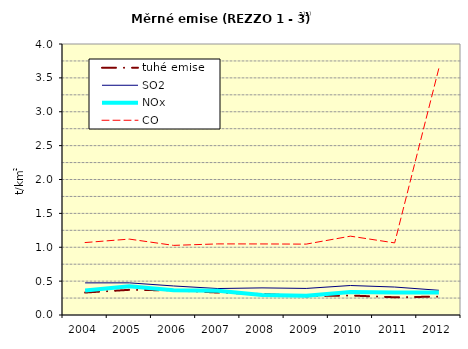
| Category | tuhé emise | SO2 | NOx | CO |
|---|---|---|---|---|
| 2004.0 | 0.332 | 0.474 | 0.361 | 1.069 |
| 2005.0 | 0.372 | 0.475 | 0.425 | 1.12 |
| 2006.0 | 0.363 | 0.429 | 0.364 | 1.028 |
| 2007.0 | 0.331 | 0.391 | 0.357 | 1.049 |
| 2008.0 | 0.311 | 0.4 | 0.296 | 1.049 |
| 2009.0 | 0.278 | 0.392 | 0.285 | 1.046 |
| 2010.0 | 0.288 | 0.435 | 0.338 | 1.164 |
| 2011.0 | 0.262 | 0.413 | 0.331 | 1.064 |
| 2012.0 | 0.271 | 0.365 | 0.331 | 3.643 |